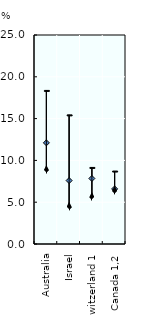
| Category | Below upper secondary education | Upper secondary or post-secondary non-tertiary education | Tertiary education |
|---|---|---|---|
| Australia | 18.371 | 12.099 | 8.912 |
| Israel | 15.444 | 7.589 | 4.505 |
| Switzerland 1 | 9.159 | 7.838 | 5.689 |
| Canada 1,2 | 8.725 | 6.589 | 6.429 |